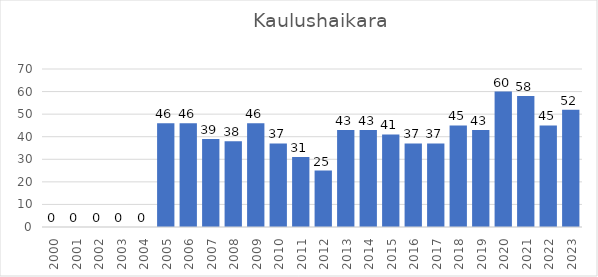
| Category | Series 0 |
|---|---|
| 2000.0 | 0 |
| 2001.0 | 0 |
| 2002.0 | 0 |
| 2003.0 | 0 |
| 2004.0 | 0 |
| 2005.0 | 46 |
| 2006.0 | 46 |
| 2007.0 | 39 |
| 2008.0 | 38 |
| 2009.0 | 46 |
| 2010.0 | 37 |
| 2011.0 | 31 |
| 2012.0 | 25 |
| 2013.0 | 43 |
| 2014.0 | 43 |
| 2015.0 | 41 |
| 2016.0 | 37 |
| 2017.0 | 37 |
| 2018.0 | 45 |
| 2019.0 | 43 |
| 2020.0 | 60 |
| 2021.0 | 58 |
| 2022.0 | 45 |
| 2023.0 | 52 |